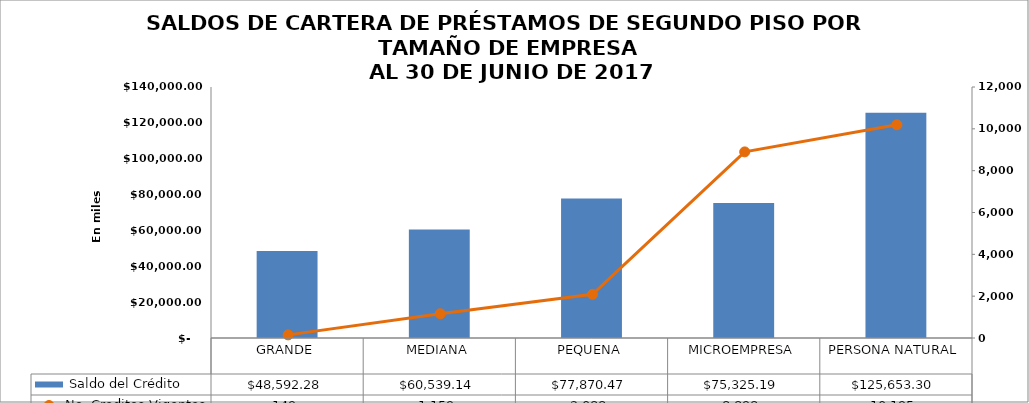
| Category |  Saldo del Crédito |
|---|---|
| GRANDE | 48592.283 |
| MEDIANA | 60539.141 |
| PEQUENA | 77870.47 |
| MICROEMPRESA | 75325.192 |
| PERSONA NATURAL | 125653.301 |